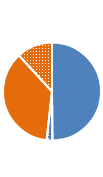
| Category | Series 0 |
|---|---|
| Full-Time | 0.499 |
| Part-Time | 0.019 |
| Full-Time | 0.364 |
| Part-Time | 0.118 |